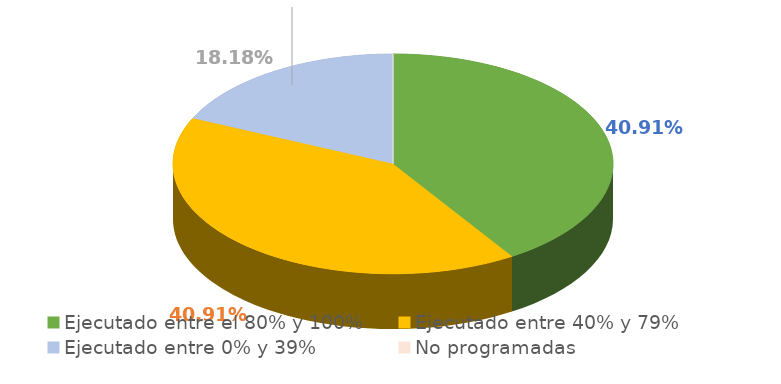
| Category | Series 0 |
|---|---|
| Ejecutado entre el 80% y 100% | 0.409 |
| Ejecutado entre 40% y 79% | 0.409 |
| Ejecutado entre 0% y 39% | 0.182 |
| No programadas | 0 |